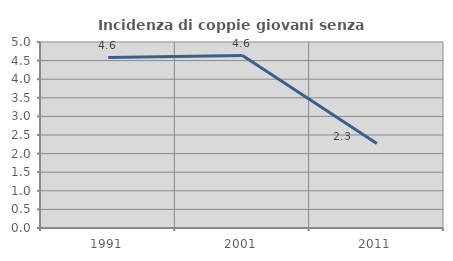
| Category | Incidenza di coppie giovani senza figli |
|---|---|
| 1991.0 | 4.583 |
| 2001.0 | 4.636 |
| 2011.0 | 2.273 |